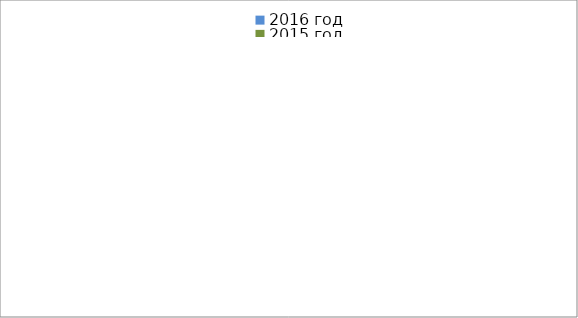
| Category | 2016 год | 2015 год |
|---|---|---|
|  - поджог | 2 | 17 |
|  - неосторожное обращение с огнём | 0 | 8 |
|  - НПТЭ электрооборудования | 2 | 2 |
|  - НПУ и Э печей | 10 | 13 |
|  - НПУ и Э транспортных средств | 17 | 9 |
|   -Шалость с огнем детей | 0 | 1 |
|  -НППБ при эксплуатации эл.приборов | 11 | 2 |
|  - курение | 5 | 0 |
| - прочие | 19 | 19 |
| - не установленные причины | 0 | 7 |